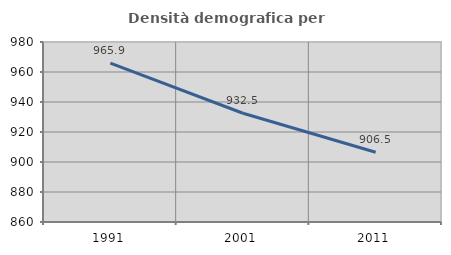
| Category | Densità demografica |
|---|---|
| 1991.0 | 965.878 |
| 2001.0 | 932.512 |
| 2011.0 | 906.497 |